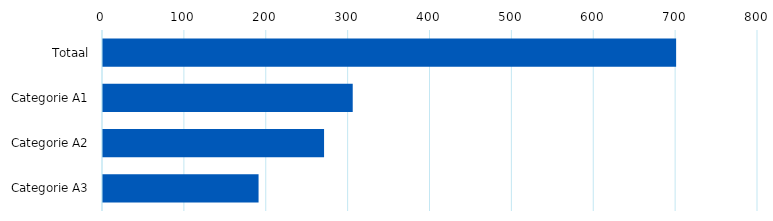
| Category | Onderwerp 2 (aantal) |
|---|---|
| Totaal | 700 |
| Categorie A1 | 305 |
| Categorie A2 | 270 |
| Categorie A3 | 190 |